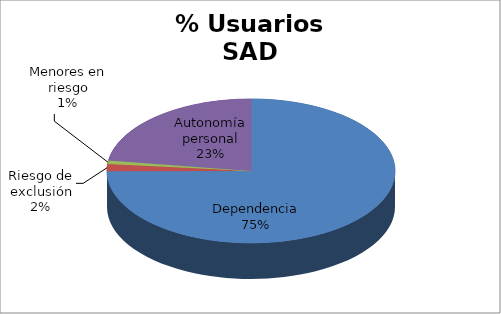
| Category | Series 0 |
|---|---|
| Dependencia | 3283 |
| Riesgo de exclusión | 71 |
| Menores en riesgo | 34 |
| Autonomía personal | 995 |